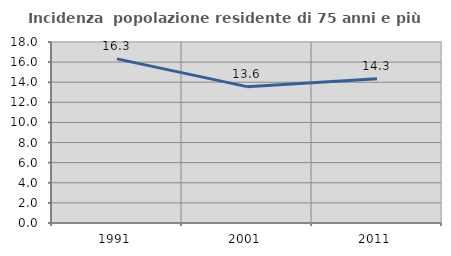
| Category | Incidenza  popolazione residente di 75 anni e più |
|---|---|
| 1991.0 | 16.319 |
| 2001.0 | 13.559 |
| 2011.0 | 14.346 |